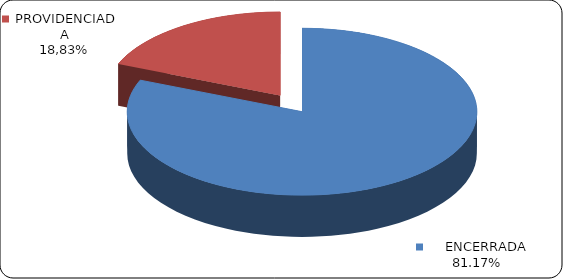
| Category | Series 0 |
|---|---|
|      ENCERRADA | 0.812 |
|      PROVIDENCIADA | 0.188 |